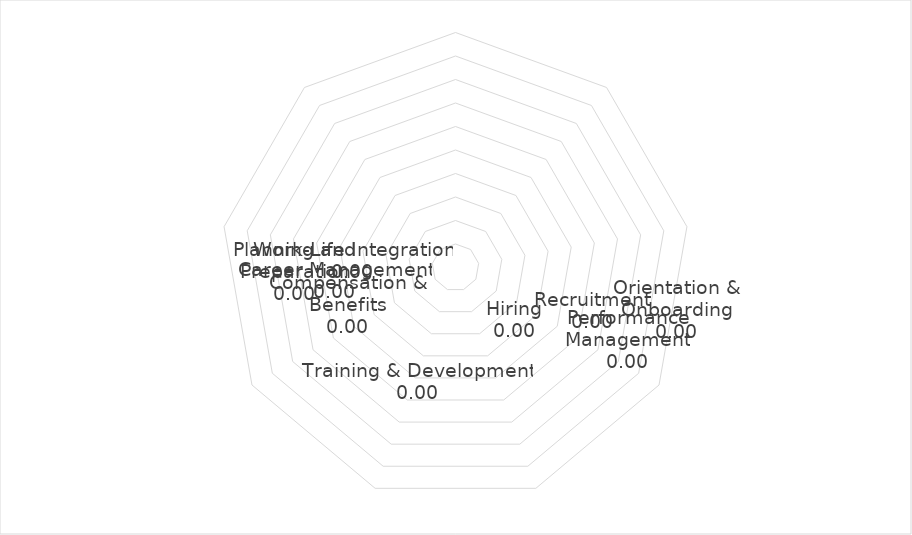
| Category | Sub-Domain Score |
|---|---|
| Planning and Preparation | 0 |
| Recruitment | 0 |
| Hiring | 0 |
| Orientation & Onboarding | 0 |
| Performance Management | 0 |
| Training & Development | 0 |
| Compensation & Benefits | 0 |
| Work-Life Integration | 0 |
| Career Management | 0 |